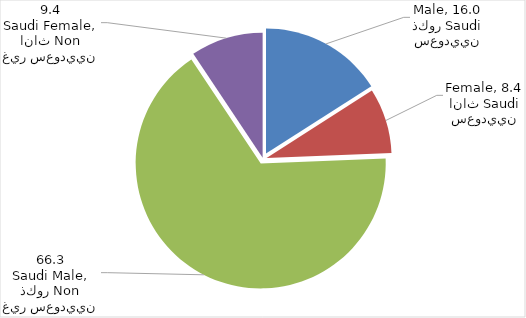
| Category | Series 0 |
|---|---|
| سعوديين ذكور Saudi Male | 15.951 |
| سعوديين اناث Saudi Female | 8.428 |
| غير سعوديين ذكور Non Saudi Male | 66.26 |
| غير سعوديين اناث Non Saudi Female | 9.361 |